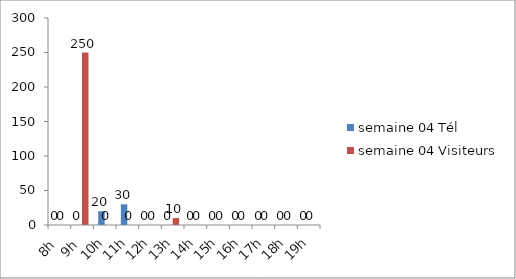
| Category | semaine 04 Tél | semaine 04 Visiteurs |
|---|---|---|
| 8h | 0 | 0 |
| 9h | 0 | 250 |
| 10h | 20 | 0 |
| 11h | 30 | 0 |
| 12h | 0 | 0 |
| 13h | 0 | 10 |
| 14h | 0 | 0 |
| 15h | 0 | 0 |
| 16h | 0 | 0 |
| 17h | 0 | 0 |
| 18h | 0 | 0 |
| 19h | 0 | 0 |